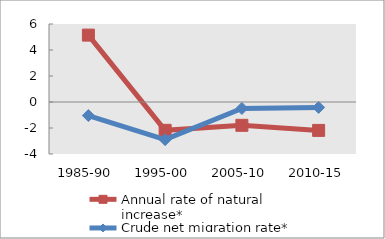
| Category | Annual rate of natural increase* | Crude net migration rate* |
|---|---|---|
| 1985-90 | 5.145 | -1.043 |
| 1995-00 | -2.178 | -2.895 |
| 2005-10 | -1.794 | -0.496 |
| 2010-15 | -2.185 | -0.414 |